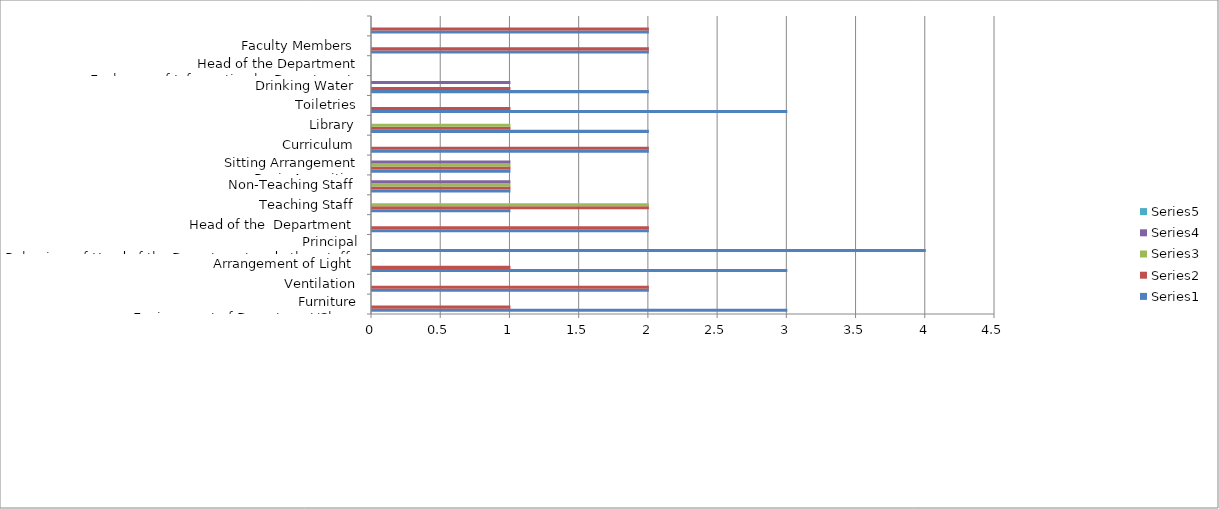
| Category | Series 0 | Series 1 | Series 2 | Series 3 | Series 4 |
|---|---|---|---|---|---|
| 0 | 3 | 1 | 0 | 0 | 0 |
| 1 | 2 | 2 | 0 | 0 | 0 |
| 2 | 3 | 1 | 0 | 0 | 0 |
| 3 | 4 | 0 | 0 | 0 | 0 |
| 4 | 2 | 2 | 0 | 0 | 0 |
| 5 | 1 | 2 | 2 | 0 | 0 |
| 6 | 1 | 1 | 1 | 1 | 0 |
| 7 | 1 | 1 | 1 | 1 | 0 |
| 8 | 2 | 2 | 0 | 0 | 0 |
| 9 | 2 | 1 | 1 | 0 | 0 |
| 10 | 3 | 1 | 0 | 0 | 0 |
| 11 | 2 | 1 | 0 | 1 | 0 |
| 12 | 2 | 2 | 0 | 0 | 0 |
| 13 | 2 | 2 | 0 | 0 | 0 |